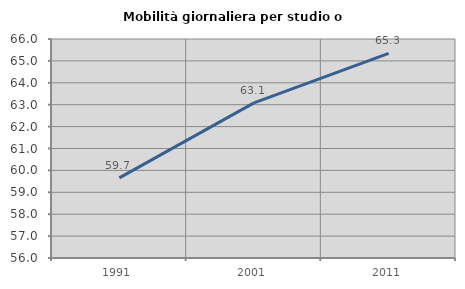
| Category | Mobilità giornaliera per studio o lavoro |
|---|---|
| 1991.0 | 59.66 |
| 2001.0 | 63.086 |
| 2011.0 | 65.34 |